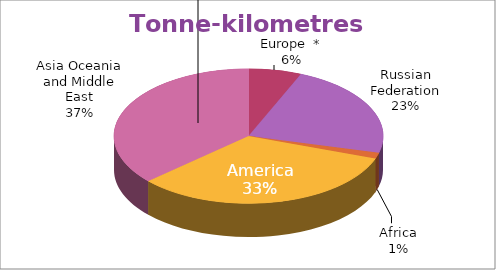
| Category | Series 0 |
|---|---|
| Europe  * | 621.4 |
| Russian Federation | 2222.388 |
| Africa | 139.12 |
| America | 3231.048 |
| Asia Oceania and Middle East | 3592.422 |